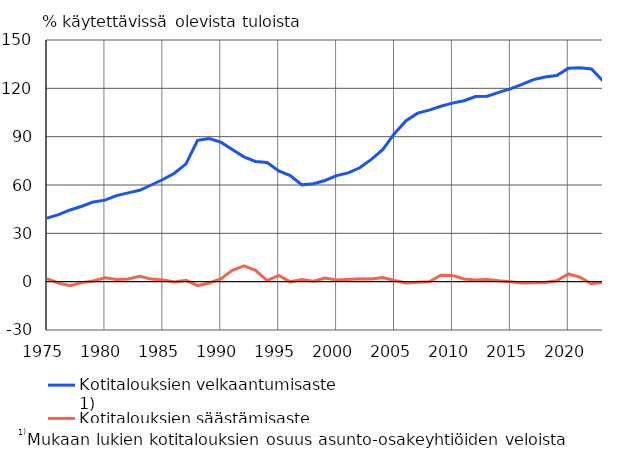
| Category | Kotitalouksien velkaantumisaste 1)  | Kotitalouksien säästämisaste |
|---|---|---|
| 1975 | 39.4 | 1.9 |
| 1976 | 41.6 | -0.9 |
| 1977 | 44.5 | -2.5 |
| 1978 | 46.8 | -0.6 |
| 1979 | 49.5 | 0.4 |
| 1980 | 50.6 | 2.4 |
| 1981 | 53.4 | 1.3 |
| 1982 | 55.1 | 1.7 |
| 1983 | 56.7 | 3.3 |
| 1984 | 60 | 1.6 |
| 1985 | 63.4 | 1.1 |
| 1986 | 67.3 | -0.2 |
| 1987 | 73.1 | 0.8 |
| 1988 | 87.7 | -2.5 |
| 1989 | 88.8 | -0.8 |
| 1990 | 86.6 | 1.7 |
| 1991 | 82 | 7.1 |
| 1992 | 77.5 | 9.8 |
| 1993 | 74.6 | 7 |
| 1994 | 74 | 0.7 |
| 1995 | 68.7 | 3.9 |
| 1996 | 65.8 | -0.1 |
| 1997 | 60.1 | 1.4 |
| 1998 | 60.8 | 0.3 |
| 1999 | 62.8 | 2.2 |
| 2000 | 65.8 | 1.1 |
| 2001 | 67.5 | 1.4 |
| 2002 | 70.7 | 1.8 |
| 2003 | 75.9 | 1.6 |
| 2004 | 82.1 | 2.6 |
| 2005 | 92 | 0.7 |
| 2006 | 99.9 | -0.8 |
| 2007 | 104.6 | -0.3 |
| 2008 | 106.5 | -0.1 |
| 2009 | 108.9 | 4 |
| 2010 | 110.8 | 3.9 |
| 2011 | 112.3 | 1.7 |
| 2012 | 114.9 | 1 |
| 2013 | 115.1 | 1.4 |
| 2014 | 117.5 | 0.5 |
| 2015 | 119.7 | 0 |
| 2016 | 122.4 | -0.8 |
| 2017 | 125.4 | -0.6 |
| 2018 | 127 | -0.5 |
| 2019 | 128 | 0.6 |
| 2020 | 132.4 | 4.8 |
| 2021 | 132.7 | 2.8 |
| 2022* | 132 | -1.3 |
| 2023* | 124.6 | -0.4 |